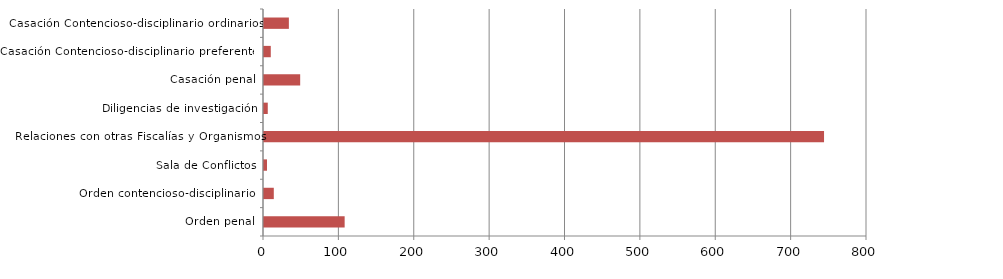
| Category | Series 1 |
|---|---|
| Orden penal | 107 |
| Orden contencioso-disciplinario  | 13 |
| Sala de Conflictos | 4 |
| Relaciones con otras Fiscalías y Organismos | 743 |
| Diligencias de investigación | 5 |
| Casación penal | 48 |
| Casación Contencioso-disciplinario preferentes | 9 |
| Casación Contencioso-disciplinario ordinarios | 33 |